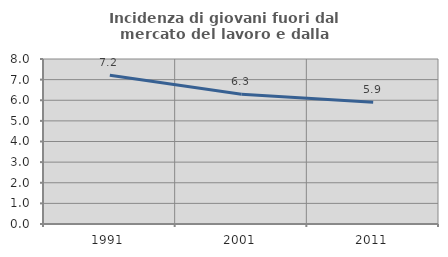
| Category | Incidenza di giovani fuori dal mercato del lavoro e dalla formazione  |
|---|---|
| 1991.0 | 7.211 |
| 2001.0 | 6.29 |
| 2011.0 | 5.907 |